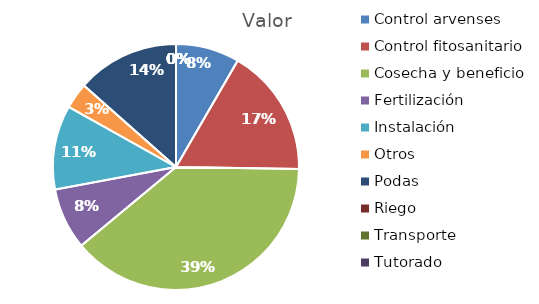
| Category | Valor |
|---|---|
| Control arvenses | 3676644 |
| Control fitosanitario | 7415604 |
| Cosecha y beneficio | 17012268 |
| Fertilización | 3552012 |
| Instalación | 4860648 |
| Otros | 1495584 |
| Podas | 5920020 |
| Riego | 0 |
| Transporte | 0 |
| Tutorado | 0 |